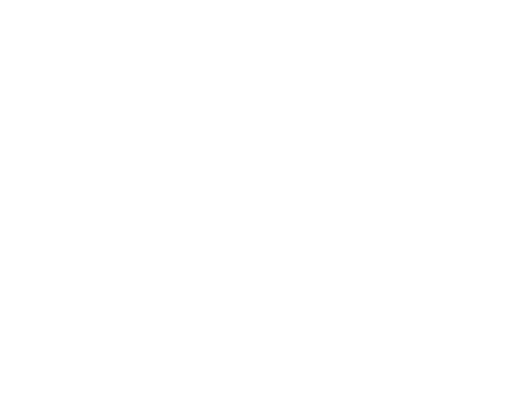
| Category | Series 0 | Series 1 | Series 2 |
|---|---|---|---|
| Impuestos | 2423620 | 0.139 |  |
| Cuotas y Aportaciones de Seguridad Social | 0 | 0 |  |
| Contribuciones de Mejoras | 0 | 0 |  |
| Derechos | 513855.2 | 0.029 |  |
| Productos | 0 | 0 |  |
| Aprovechamientos | 16000 | 0.001 |  |
| Ingresos por Ventas de Bienes y Servicios | 0 | 0 |  |
| Participaciones y Aportaciones | 14531987.21 | 0.831 |  |
| Transferencias, Asignaciones, Subsidios y Otras Ayudas | 0 | 0 |  |
| Ingresos Derivados de Financiamientos | 0 | 0 |  |